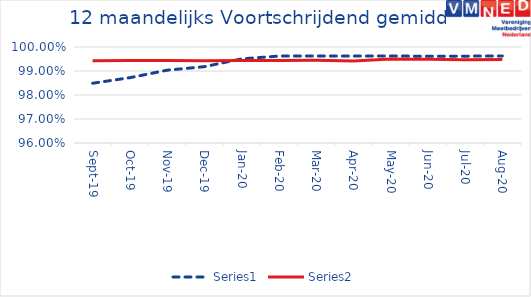
| Category | Series 0 | Series 1 |
|---|---|---|
| 2019-09-01 | 0.985 | 0.994 |
| 2019-10-01 | 0.987 | 0.994 |
| 2019-11-01 | 0.99 | 0.994 |
| 2019-12-01 | 0.992 | 0.994 |
| 2020-01-01 | 0.995 | 0.994 |
| 2020-02-01 | 0.996 | 0.994 |
| 2020-03-01 | 0.996 | 0.994 |
| 2020-04-01 | 0.996 | 0.994 |
| 2020-05-01 | 0.996 | 0.995 |
| 2020-06-01 | 0.996 | 0.995 |
| 2020-07-01 | 0.996 | 0.995 |
| 2020-08-01 | 0.996 | 0.995 |